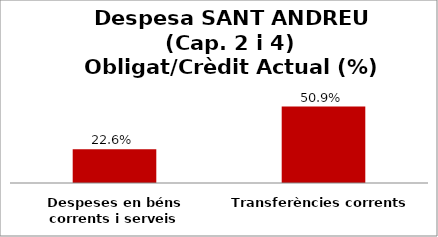
| Category | Series 0 |
|---|---|
| Despeses en béns corrents i serveis | 0.226 |
| Transferències corrents | 0.509 |